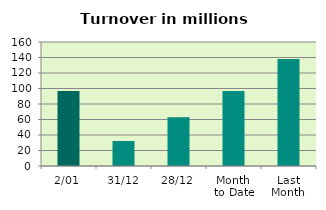
| Category | Series 0 |
|---|---|
| 2/01 | 96.757 |
| 31/12 | 32.246 |
| 28/12 | 62.791 |
| Month 
to Date | 96.757 |
| Last
Month | 138.201 |